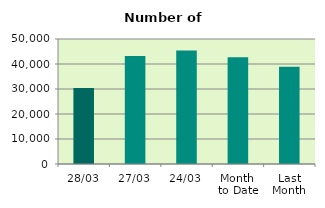
| Category | Series 0 |
|---|---|
| 28/03 | 30392 |
| 27/03 | 43206 |
| 24/03 | 45352 |
| Month 
to Date | 42681.7 |
| Last
Month | 38877.2 |